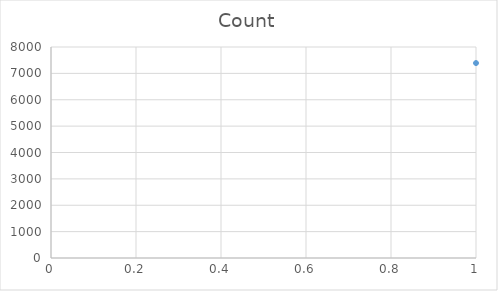
| Category | Count |
|---|---|
| 0 | 7391 |
| 1 | 785 |
| 2 | 500 |
| 3 | 271 |
| 4 | 140 |
| 5 | 122 |
| 6 | 111 |
| 7 | 109 |
| 8 | 66 |
| 9 | 56 |
| 10 | 48 |
| 11 | 42 |
| 12 | 35 |
| 13 | 27 |
| 14 | 25 |
| 15 | 22 |
| 16 | 20 |
| 17 | 18 |
| 18 | 16 |
| 19 | 16 |
| 20 | 16 |
| 21 | 15 |
| 22 | 15 |
| 23 | 14 |
| 24 | 14 |
| 25 | 14 |
| 26 | 14 |
| 27 | 13 |
| 28 | 12 |
| 29 | 12 |
| 30 | 10 |
| 31 | 10 |
| 32 | 10 |
| 33 | 9 |
| 34 | 9 |
| 35 | 9 |
| 36 | 9 |
| 37 | 9 |
| 38 | 8 |
| 39 | 5 |
| 40 | 5 |
| 41 | 5 |
| 42 | 4 |
| 43 | 4 |
| 44 | 3 |
| 45 | 3 |
| 46 | 3 |
| 47 | 3 |
| 48 | 2 |
| 49 | 2 |
| 50 | 2 |
| 51 | 2 |
| 52 | 2 |
| 53 | 2 |
| 54 | 2 |
| 55 | 2 |
| 56 | 2 |
| 57 | 1 |
| 58 | 1 |
| 59 | 1 |
| 60 | 1 |
| 61 | 1 |
| 62 | 1 |
| 63 | 1 |
| 64 | 1 |
| 65 | 1 |
| 66 | 1 |
| 67 | 1 |
| 68 | 1 |
| 69 | 1 |
| 70 | 1 |
| 71 | 1 |
| 72 | 1 |
| 73 | 1 |
| 74 | 1 |
| 75 | 1 |
| 76 | 1 |
| 77 | 1 |
| 78 | 1 |
| 79 | 1 |
| 80 | 1 |
| 81 | 1 |
| 82 | 1 |
| 83 | 1 |
| 84 | 1 |
| 85 | 1 |
| 86 | 1 |
| 87 | 1 |
| 88 | 1 |